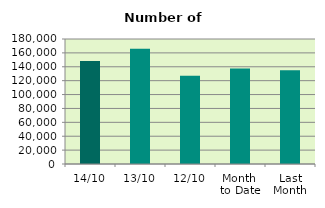
| Category | Series 0 |
|---|---|
| 14/10 | 148166 |
| 13/10 | 165782 |
| 12/10 | 127038 |
| Month 
to Date | 137490.6 |
| Last
Month | 134880 |